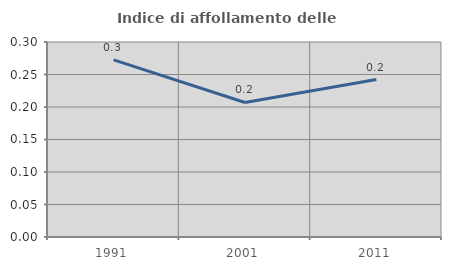
| Category | Indice di affollamento delle abitazioni  |
|---|---|
| 1991.0 | 0.272 |
| 2001.0 | 0.207 |
| 2011.0 | 0.242 |